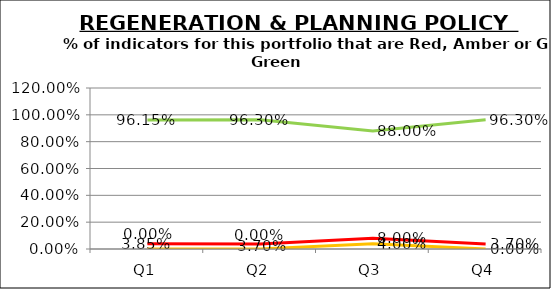
| Category | Green | Amber | Red |
|---|---|---|---|
| Q1 | 0.962 | 0 | 0.038 |
| Q2 | 0.963 | 0 | 0.037 |
| Q3 | 0.88 | 0.04 | 0.08 |
| Q4 | 0.963 | 0 | 0.037 |